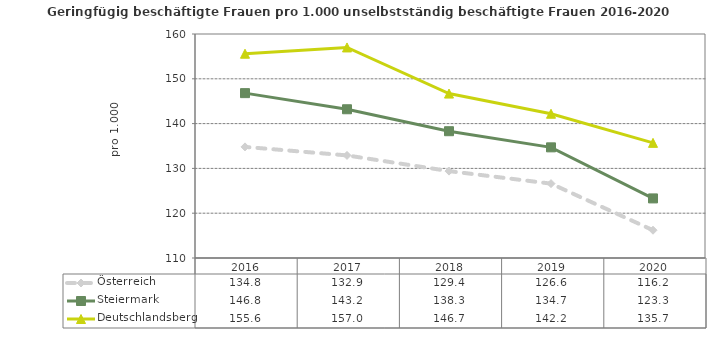
| Category | Österreich | Steiermark | Deutschlandsberg |
|---|---|---|---|
| 2020.0 | 116.2 | 123.3 | 135.7 |
| 2019.0 | 126.6 | 134.7 | 142.2 |
| 2018.0 | 129.4 | 138.3 | 146.7 |
| 2017.0 | 132.9 | 143.2 | 157 |
| 2016.0 | 134.8 | 146.8 | 155.6 |